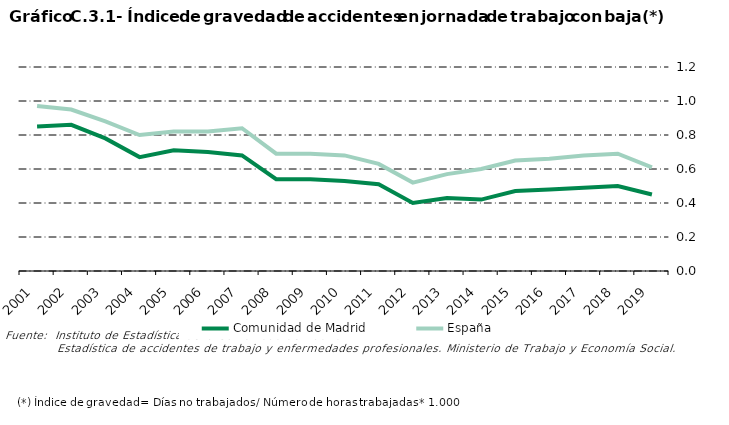
| Category | Comunidad de Madrid | España |
|---|---|---|
| 2001.0 | 0.85 | 0.97 |
| 2002.0 | 0.86 | 0.95 |
| 2003.0 | 0.78 | 0.88 |
| 2004.0 | 0.67 | 0.8 |
| 2005.0 | 0.71 | 0.82 |
| 2006.0 | 0.7 | 0.82 |
| 2007.0 | 0.68 | 0.84 |
| 2008.0 | 0.54 | 0.69 |
| 2009.0 | 0.54 | 0.69 |
| 2010.0 | 0.53 | 0.68 |
| 2011.0 | 0.51 | 0.63 |
| 2012.0 | 0.4 | 0.52 |
| 2013.0 | 0.43 | 0.57 |
| 2014.0 | 0.42 | 0.6 |
| 2015.0 | 0.47 | 0.65 |
| 2016.0 | 0.48 | 0.66 |
| 2017.0 | 0.49 | 0.68 |
| 2018.0 | 0.5 | 0.69 |
| 2019.0 | 0.45 | 0.61 |